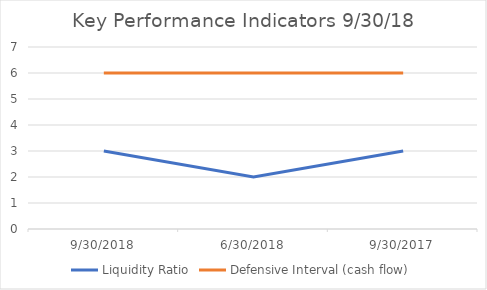
| Category | Liquidity Ratio | Defensive Interval (cash flow) |
|---|---|---|
| 9/30/18 | 3 | 6 |
| 6/30/18 | 2 | 6 |
| 9/30/17 | 3 | 6 |